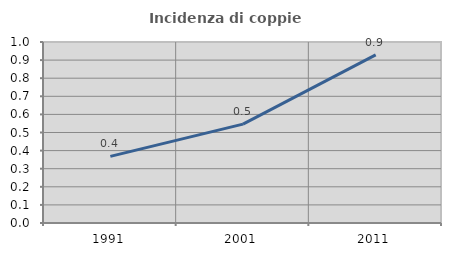
| Category | Incidenza di coppie miste |
|---|---|
| 1991.0 | 0.368 |
| 2001.0 | 0.546 |
| 2011.0 | 0.929 |